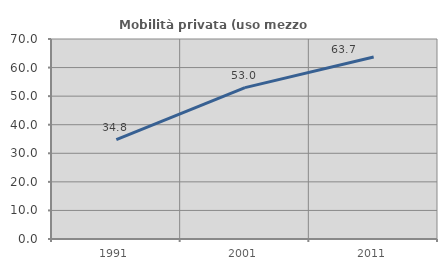
| Category | Mobilità privata (uso mezzo privato) |
|---|---|
| 1991.0 | 34.816 |
| 2001.0 | 52.986 |
| 2011.0 | 63.72 |